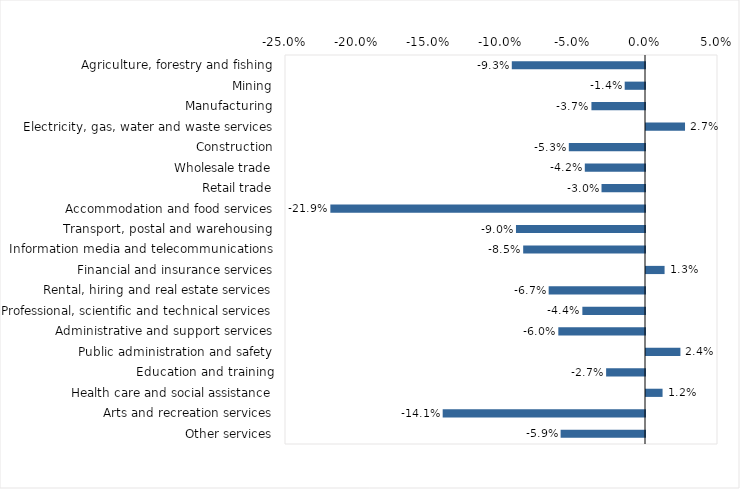
| Category | This week |
|---|---|
| Agriculture, forestry and fishing | -0.092 |
| Mining | -0.014 |
| Manufacturing | -0.037 |
| Electricity, gas, water and waste services | 0.027 |
| Construction | -0.053 |
| Wholesale trade | -0.042 |
| Retail trade | -0.03 |
| Accommodation and food services | -0.218 |
| Transport, postal and warehousing | -0.09 |
| Information media and telecommunications | -0.085 |
| Financial and insurance services | 0.013 |
| Rental, hiring and real estate services | -0.067 |
| Professional, scientific and technical services | -0.044 |
| Administrative and support services | -0.06 |
| Public administration and safety | 0.024 |
| Education and training | -0.027 |
| Health care and social assistance | 0.012 |
| Arts and recreation services | -0.14 |
| Other services | -0.059 |